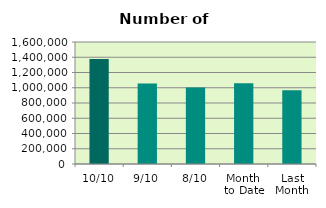
| Category | Series 0 |
|---|---|
| 10/10 | 1377790 |
| 9/10 | 1057346 |
| 8/10 | 1002960 |
| Month 
to Date | 1057809.75 |
| Last
Month | 967047.5 |